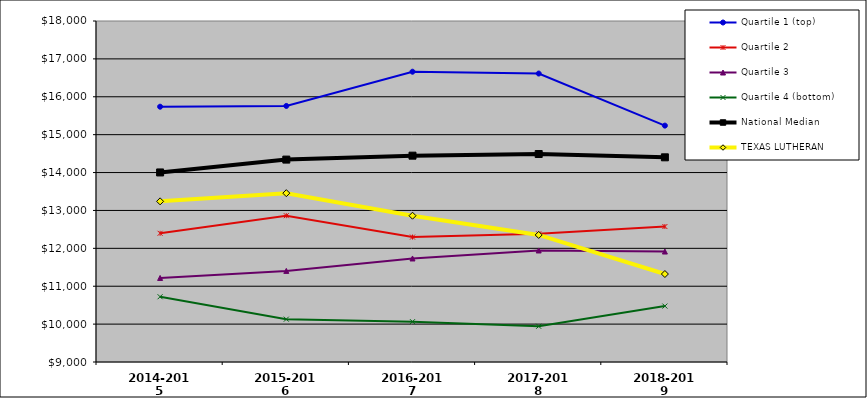
| Category | Quartile 1 (top) | Quartile 2 | Quartile 3 | Quartile 4 (bottom) | National Median |  TEXAS LUTHERAN  |
|---|---|---|---|---|---|---|
| 2014-2015 | 15737.652 | 12397.241 | 11218.589 | 10722.275 | 14002.887 | 13239.91 |
| 2015-2016 | 15757.985 | 12861.596 | 11404.89 | 10130.515 | 14342.086 | 13456.186 |
| 2016-2017 | 16661.548 | 12297.345 | 11732.248 | 10064.001 | 14445.621 | 12861.172 |
| 2017-2018 | 16613.339 | 12382.126 | 11943.255 | 9943.387 | 14489.448 | 12353.524 |
| 2018-2019 | 15238.504 | 12575.236 | 11915.516 | 10476.184 | 14402.238 | 11322.153 |